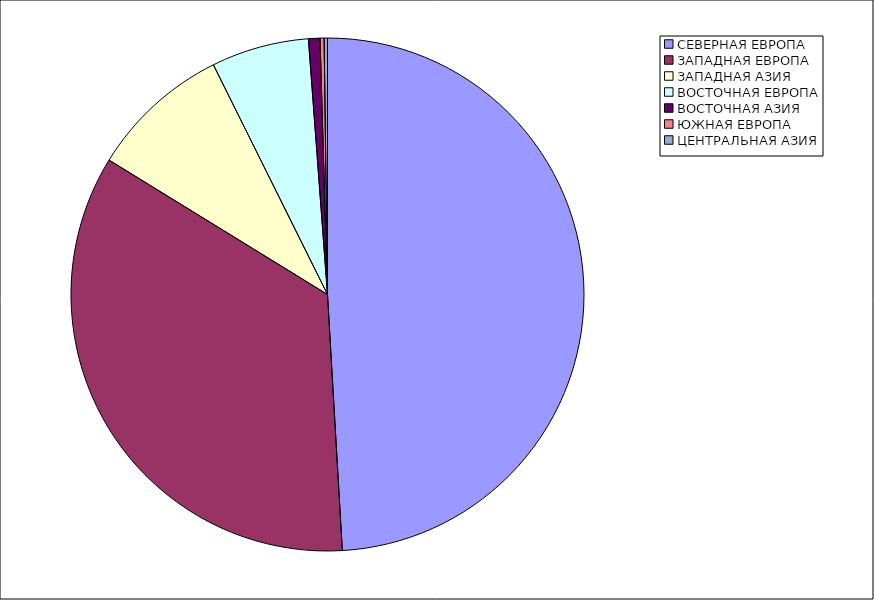
| Category | Оборот |
|---|---|
| СЕВЕРНАЯ ЕВРОПА | 49.078 |
| ЗАПАДНАЯ ЕВРОПА | 34.701 |
| ЗАПАДНАЯ АЗИЯ | 8.882 |
| ВОСТОЧНАЯ ЕВРОПА | 6.153 |
| ВОСТОЧНАЯ АЗИЯ | 0.721 |
| ЮЖНАЯ ЕВРОПА | 0.254 |
| ЦЕНТРАЛЬНАЯ АЗИЯ | 0.211 |